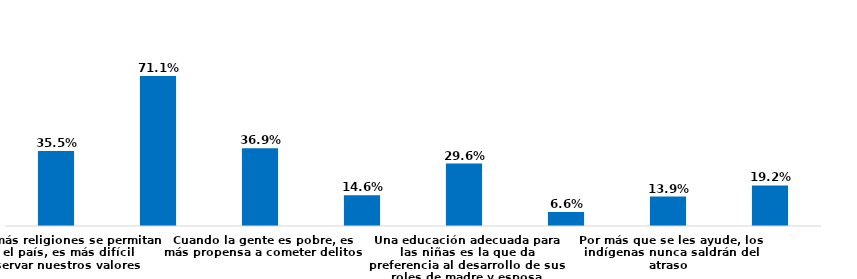
| Category | Series 0 |
|---|---|
| Entre más religiones se permitan en el país, es más difícil preservar nuestros valores | 0.355 |
| A los homosexuales se les debe permitir ser profesores de colegio | 0.711 |
| Cuando la gente es pobre, es más propensa a cometer delitos | 0.369 |
| Por sus características, los negros siempre tendrán limitaciones | 0.146 |
| Una educación adecuada para las niñas es la que da preferencia al desarrollo de sus roles de madre y esposa | 0.296 |
| Las personas enfermas de SIDA deben ser alejadas del resto de las personas | 0.066 |
| Por más que se les ayude, los indígenas nunca saldrán del atraso | 0.139 |
| Las personas discapacitadas pueden ser buenas trabajadoras, pero no en niveles directivos | 0.192 |